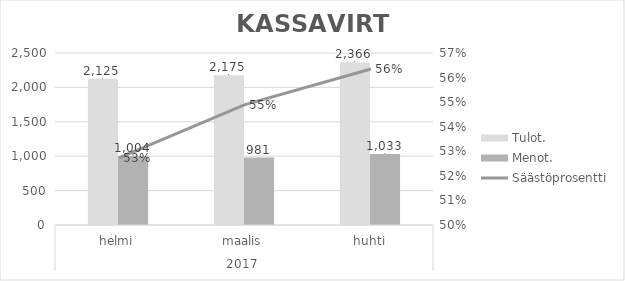
| Category | Tulot. | Menot. |
|---|---|---|
| 0 | 2124.7 | 1004.354 |
| 1 | 2175.15 | 980.954 |
| 2 | 2366.45 | 1032.952 |